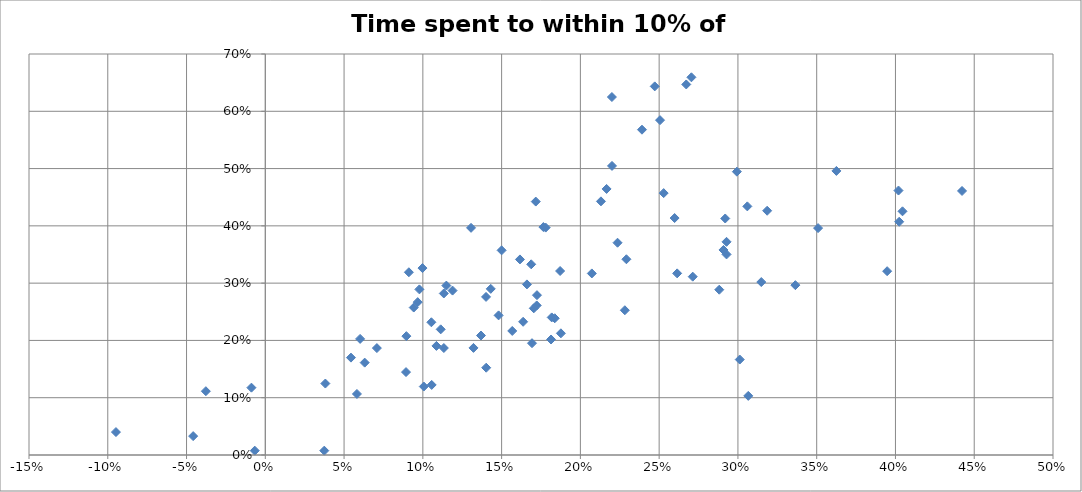
| Category | Time spent to within 10% of Max |
|---|---|
| 0.2704757356241334 | 0.659 |
| 0.26720270086379605 | 0.647 |
| 0.2472121035572361 | 0.643 |
| 0.22001720977415817 | 0.625 |
| 0.2505590700420621 | 0.585 |
| 0.2390981226171922 | 0.568 |
| 0.22007179123952914 | 0.505 |
| 0.3625080379411114 | 0.496 |
| 0.29932824689196513 | 0.495 |
| 0.21663121852953693 | 0.464 |
| 0.40192072158253134 | 0.462 |
| 0.44226267794218566 | 0.461 |
| 0.2528654128644552 | 0.457 |
| 0.21305584133821598 | 0.443 |
| 0.17168184598444114 | 0.442 |
| 0.30598040042452657 | 0.434 |
| 0.31856432521558653 | 0.426 |
| 0.4044697967420938 | 0.425 |
| 0.25981018426637514 | 0.414 |
| 0.2919505794528672 | 0.413 |
| 0.40238279616813233 | 0.407 |
| 0.17651560448358072 | 0.398 |
| 0.17796469495507683 | 0.397 |
| 0.13059866747598647 | 0.397 |
| 0.35088439314180087 | 0.396 |
| 0.2927746461527725 | 0.372 |
| 0.22357536346305662 | 0.371 |
| 0.29082191950985714 | 0.358 |
| 0.1499967800926847 | 0.357 |
| 0.29276974744080264 | 0.35 |
| 0.22921101175754255 | 0.342 |
| 0.1616459666266694 | 0.341 |
| 0.16878682899502406 | 0.333 |
| 0.09976845493937625 | 0.326 |
| 0.1871272157749333 | 0.321 |
| 0.39472404160915464 | 0.321 |
| 0.09112967647948089 | 0.319 |
| 0.26141138496031213 | 0.317 |
| 0.20726102099662347 | 0.317 |
| 0.27132201379784404 | 0.311 |
| 0.31482871987846583 | 0.302 |
| 0.16606492018040875 | 0.298 |
| 0.33646464945226917 | 0.297 |
| 0.11493509430686655 | 0.296 |
| 0.14311080209474625 | 0.29 |
| 0.09780177667593959 | 0.289 |
| 0.2881617525897302 | 0.289 |
| 0.11885378312458972 | 0.287 |
| 0.11330404599876953 | 0.282 |
| 0.17244041837397495 | 0.279 |
| 0.14012133062672438 | 0.276 |
| 0.09674333346891006 | 0.267 |
| 0.1722774725339813 | 0.261 |
| 0.09420834728666927 | 0.257 |
| 0.17041157872095125 | 0.256 |
| 0.22821276820775305 | 0.253 |
| 0.14809434756872486 | 0.244 |
| 0.1818113177089209 | 0.24 |
| 0.18372900665969172 | 0.239 |
| 0.16366326392410802 | 0.233 |
| 0.10541088124694586 | 0.232 |
| 0.11132923524478433 | 0.219 |
| 0.15674414420565674 | 0.217 |
| 0.18763050920725166 | 0.212 |
| 0.13690551231672266 | 0.209 |
| 0.0895446037048373 | 0.207 |
| 0.06018470082600236 | 0.203 |
| 0.18137679038118137 | 0.202 |
| 0.16929344734568885 | 0.195 |
| 0.10862707503601499 | 0.19 |
| 0.13213774223032182 | 0.187 |
| 0.11333165027696146 | 0.187 |
| 0.07082865857593013 | 0.187 |
| 0.054364887650484084 | 0.17 |
| 0.3011643058240654 | 0.167 |
| 0.06309106381009455 | 0.161 |
| 0.14022427017344175 | 0.152 |
| 0.08931882185213436 | 0.145 |
| 0.03811412154449423 | 0.125 |
| 0.1056065236240793 | 0.122 |
| 0.10059584082206263 | 0.12 |
| -0.008806301565636776 | 0.118 |
| -0.03774488096539497 | 0.111 |
| 0.058163593543083536 | 0.107 |
| 0.3065694093962219 | 0.103 |
| -0.09481480004224496 | 0.04 |
| -0.045802403596455155 | 0.033 |
| 0.037439363389035085 | 0.008 |
| -0.0066959085202144 | 0.008 |